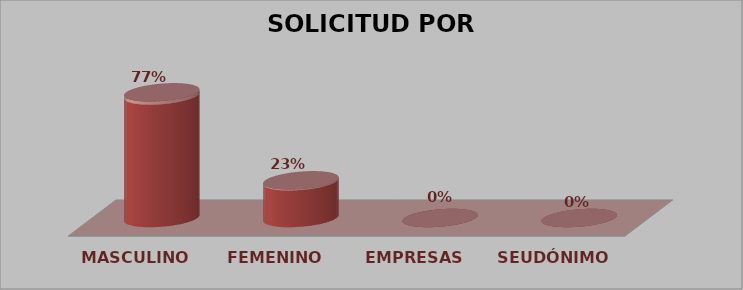
| Category | SOLICITUD POR GÉNERO | Series 1 |
|---|---|---|
| MASCULINO | 30 | 0.769 |
| FEMENINO | 9 | 0.231 |
| EMPRESAS | 0 | 0 |
| SEUDÓNIMO | 0 | 0 |